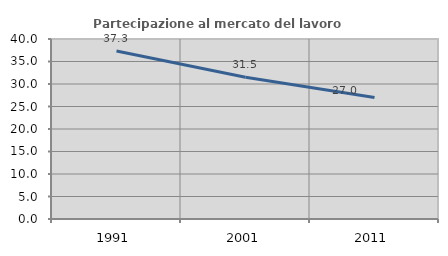
| Category | Partecipazione al mercato del lavoro  femminile |
|---|---|
| 1991.0 | 37.331 |
| 2001.0 | 31.514 |
| 2011.0 | 26.995 |